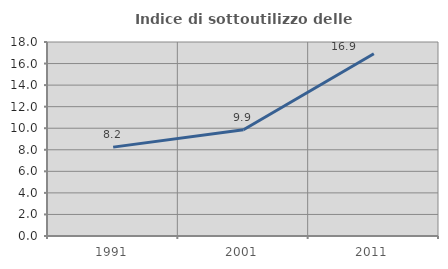
| Category | Indice di sottoutilizzo delle abitazioni  |
|---|---|
| 1991.0 | 8.246 |
| 2001.0 | 9.861 |
| 2011.0 | 16.908 |